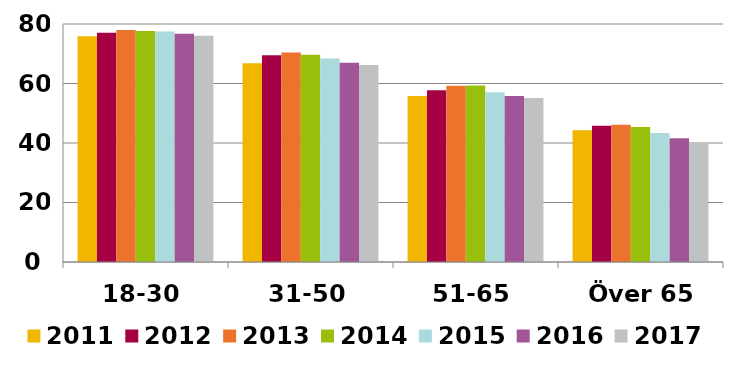
| Category | 2011 | 2012 | 2013 | 2014 | 2015 | 2016 | 2017 |
|---|---|---|---|---|---|---|---|
| 18-30 | 75.883 | 77.061 | 77.976 | 77.649 | 77.49 | 76.7 | 76.03 |
| 31-50 | 66.766 | 69.466 | 70.39 | 69.681 | 68.413 | 67 | 66.184 |
| 51-65 | 55.823 | 57.711 | 59.251 | 59.315 | 57.082 | 55.8 | 55.084 |
| Över 65 | 44.283 | 45.782 | 46.151 | 45.372 | 43.339 | 41.6 | 40.217 |